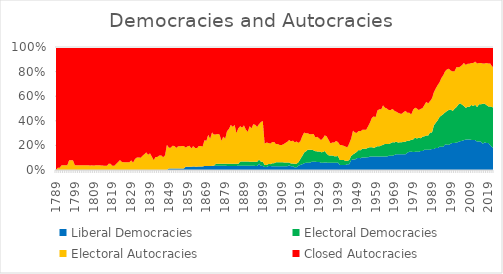
| Category | Liberal Democracies | Electoral Democracies | Electoral Autocracies | Closed Autocracies |
|---|---|---|---|---|
| 1789.0 | 0 | 0 | 0 | 50 |
| 1790.0 | 0 | 0 | 1 | 51 |
| 1791.0 | 0 | 0 | 1 | 51 |
| 1792.0 | 0 | 0 | 2 | 50 |
| 1793.0 | 0 | 0 | 2 | 50 |
| 1794.0 | 0 | 0 | 2 | 50 |
| 1795.0 | 0 | 0 | 2 | 50 |
| 1796.0 | 0 | 0 | 4 | 46 |
| 1797.0 | 0 | 0 | 4 | 46 |
| 1798.0 | 0 | 0 | 4 | 46 |
| 1799.0 | 0 | 0 | 2 | 48 |
| 1800.0 | 0 | 0 | 2 | 50 |
| 1801.0 | 0 | 0 | 2 | 49 |
| 1802.0 | 0 | 0 | 2 | 51 |
| 1803.0 | 0 | 0 | 2 | 50 |
| 1804.0 | 0 | 0 | 2 | 50 |
| 1805.0 | 0 | 0 | 2 | 50 |
| 1806.0 | 0 | 0 | 2 | 50 |
| 1807.0 | 0 | 0 | 2 | 52 |
| 1808.0 | 0 | 0 | 2 | 51 |
| 1809.0 | 0 | 0 | 2 | 52 |
| 1810.0 | 0 | 0 | 2 | 51 |
| 1811.0 | 0 | 0 | 2 | 50 |
| 1812.0 | 0 | 0 | 2 | 50 |
| 1813.0 | 0 | 0 | 2 | 52 |
| 1814.0 | 0 | 0 | 2 | 54 |
| 1815.0 | 0 | 0 | 2 | 57 |
| 1816.0 | 0 | 0 | 2 | 57 |
| 1817.0 | 0 | 0 | 3 | 57 |
| 1818.0 | 0 | 0 | 3 | 57 |
| 1819.0 | 0 | 0 | 2 | 57 |
| 1820.0 | 0 | 0 | 2 | 56 |
| 1821.0 | 0 | 0 | 3 | 57 |
| 1822.0 | 0 | 0 | 4 | 58 |
| 1823.0 | 0 | 0 | 5 | 57 |
| 1824.0 | 0 | 0 | 4 | 57 |
| 1825.0 | 0 | 0 | 4 | 59 |
| 1826.0 | 0 | 0 | 4 | 60 |
| 1827.0 | 0 | 0 | 4 | 60 |
| 1828.0 | 0 | 0 | 4 | 60 |
| 1829.0 | 0 | 0 | 5 | 59 |
| 1830.0 | 0 | 0 | 4 | 63 |
| 1831.0 | 0 | 0 | 6 | 62 |
| 1832.0 | 0 | 0 | 7 | 62 |
| 1833.0 | 0 | 0 | 7 | 62 |
| 1834.0 | 0 | 0 | 7 | 63 |
| 1835.0 | 0 | 0 | 8 | 62 |
| 1836.0 | 0 | 0 | 9 | 61 |
| 1837.0 | 0 | 0 | 10 | 60 |
| 1838.0 | 0 | 0 | 9 | 64 |
| 1839.0 | 0 | 0 | 10 | 64 |
| 1840.0 | 0 | 0 | 8 | 66 |
| 1841.0 | 0 | 0 | 6 | 69 |
| 1842.0 | 0 | 0 | 8 | 67 |
| 1843.0 | 0 | 0 | 8 | 67 |
| 1844.0 | 0 | 0 | 9 | 67 |
| 1845.0 | 0 | 0 | 9 | 67 |
| 1846.0 | 0 | 0 | 8 | 69 |
| 1847.0 | 0 | 0 | 9 | 67 |
| 1848.0 | 0 | 0 | 16 | 62 |
| 1849.0 | 1 | 0 | 13 | 63 |
| 1850.0 | 1 | 0 | 13 | 63 |
| 1851.0 | 1 | 0 | 14 | 61 |
| 1852.0 | 1 | 0 | 14 | 62 |
| 1853.0 | 1 | 0 | 13 | 64 |
| 1854.0 | 1 | 0 | 14 | 63 |
| 1855.0 | 1 | 0 | 14 | 63 |
| 1856.0 | 1 | 0 | 14 | 62 |
| 1857.0 | 1 | 0 | 14 | 62 |
| 1858.0 | 2 | 0 | 12 | 63 |
| 1859.0 | 2 | 0 | 13 | 63 |
| 1860.0 | 2 | 0 | 13 | 61 |
| 1861.0 | 2 | 0 | 11 | 61 |
| 1862.0 | 2 | 0 | 12 | 58 |
| 1863.0 | 2 | 0 | 11 | 60 |
| 1864.0 | 2 | 0 | 11 | 60 |
| 1865.0 | 2 | 0 | 12 | 58 |
| 1866.0 | 2 | 0 | 12 | 58 |
| 1867.0 | 2 | 0 | 11 | 55 |
| 1868.0 | 2 | 0 | 13 | 47 |
| 1869.0 | 2 | 0 | 13 | 48 |
| 1870.0 | 2 | 0 | 16 | 45 |
| 1871.0 | 2 | 0 | 14 | 47 |
| 1872.0 | 2 | 0 | 16 | 41 |
| 1873.0 | 2 | 0 | 15 | 42 |
| 1874.0 | 2 | 1 | 14 | 42 |
| 1875.0 | 2 | 1 | 14 | 41 |
| 1876.0 | 2 | 1 | 14 | 42 |
| 1877.0 | 2 | 1 | 11 | 45 |
| 1878.0 | 2 | 1 | 13 | 43 |
| 1879.0 | 2 | 1 | 12 | 44 |
| 1880.0 | 2 | 1 | 16 | 41 |
| 1881.0 | 2 | 1 | 17 | 40 |
| 1882.0 | 2 | 1 | 19 | 38 |
| 1883.0 | 2 | 1 | 18 | 39 |
| 1884.0 | 2 | 1 | 19 | 38 |
| 1885.0 | 2 | 1 | 15 | 42 |
| 1886.0 | 2 | 1 | 17 | 39 |
| 1887.0 | 2 | 2 | 17 | 38 |
| 1888.0 | 2 | 2 | 16 | 38 |
| 1889.0 | 2 | 2 | 17 | 37 |
| 1890.0 | 2 | 2 | 15 | 39 |
| 1891.0 | 2 | 2 | 14 | 40 |
| 1892.0 | 2 | 2 | 17 | 38 |
| 1893.0 | 2 | 2 | 16 | 39 |
| 1894.0 | 2 | 2 | 18 | 37 |
| 1895.0 | 2 | 2 | 18 | 38 |
| 1896.0 | 2 | 2 | 17 | 39 |
| 1897.0 | 3 | 2 | 17 | 37 |
| 1898.0 | 2 | 2 | 19 | 36 |
| 1899.0 | 2 | 2 | 20 | 36 |
| 1900.0 | 3 | 2 | 21 | 95 |
| 1901.0 | 3 | 2 | 22 | 94 |
| 1902.0 | 4 | 2 | 21 | 96 |
| 1903.0 | 4 | 2 | 21 | 99 |
| 1904.0 | 4 | 3 | 22 | 99 |
| 1905.0 | 4 | 3 | 22 | 98 |
| 1906.0 | 4 | 4 | 19 | 101 |
| 1907.0 | 4 | 4 | 19 | 101 |
| 1908.0 | 4 | 4 | 18 | 102 |
| 1909.0 | 4 | 4 | 18 | 102 |
| 1910.0 | 4 | 4 | 19 | 102 |
| 1911.0 | 4 | 4 | 21 | 103 |
| 1912.0 | 4 | 4 | 22 | 101 |
| 1913.0 | 5 | 3 | 24 | 99 |
| 1914.0 | 4 | 3 | 24 | 102 |
| 1915.0 | 4 | 3 | 25 | 102 |
| 1916.0 | 3 | 4 | 24 | 107 |
| 1917.0 | 3 | 4 | 25 | 106 |
| 1918.0 | 5 | 4 | 22 | 110 |
| 1919.0 | 6 | 7 | 21 | 111 |
| 1920.0 | 7 | 10 | 24 | 108 |
| 1921.0 | 8 | 13 | 24 | 103 |
| 1922.0 | 9 | 14 | 22 | 106 |
| 1923.0 | 9 | 16 | 20 | 106 |
| 1924.0 | 9 | 16 | 19 | 107 |
| 1925.0 | 10 | 15 | 19 | 107 |
| 1926.0 | 10 | 14 | 20 | 106 |
| 1927.0 | 10 | 13 | 17 | 111 |
| 1928.0 | 10 | 13 | 18 | 111 |
| 1929.0 | 10 | 13 | 16 | 113 |
| 1930.0 | 9 | 13 | 15 | 115 |
| 1931.0 | 9 | 13 | 17 | 112 |
| 1932.0 | 9 | 14 | 19 | 107 |
| 1933.0 | 9 | 11 | 21 | 109 |
| 1934.0 | 9 | 9 | 19 | 114 |
| 1935.0 | 9 | 9 | 15 | 119 |
| 1936.0 | 9 | 9 | 16 | 118 |
| 1937.0 | 9 | 8 | 17 | 118 |
| 1938.0 | 9 | 8 | 19 | 116 |
| 1939.0 | 9 | 8 | 17 | 116 |
| 1940.0 | 6 | 6 | 18 | 117 |
| 1941.0 | 6 | 6 | 18 | 118 |
| 1942.0 | 6 | 6 | 17 | 118 |
| 1943.0 | 6 | 5 | 17 | 119 |
| 1944.0 | 7 | 4 | 16 | 120 |
| 1945.0 | 7 | 5 | 20 | 116 |
| 1946.0 | 12 | 5 | 21 | 111 |
| 1947.0 | 13 | 6 | 29 | 102 |
| 1948.0 | 13 | 8 | 26 | 107 |
| 1949.0 | 15 | 8 | 24 | 109 |
| 1950.0 | 15 | 10 | 24 | 105 |
| 1951.0 | 15 | 10 | 24 | 107 |
| 1952.0 | 16 | 11 | 24 | 105 |
| 1953.0 | 16 | 11 | 24 | 105 |
| 1954.0 | 16 | 11 | 24 | 105 |
| 1955.0 | 16 | 12 | 27 | 100 |
| 1956.0 | 17 | 12 | 31 | 96 |
| 1957.0 | 17 | 12 | 37 | 90 |
| 1958.0 | 17 | 11 | 40 | 88 |
| 1959.0 | 17 | 12 | 38 | 89 |
| 1960.0 | 17 | 13 | 45 | 80 |
| 1961.0 | 17 | 13 | 47 | 79 |
| 1962.0 | 17 | 14 | 46 | 79 |
| 1963.0 | 17 | 15 | 50 | 74 |
| 1964.0 | 17 | 16 | 46 | 77 |
| 1965.0 | 17 | 16 | 45 | 78 |
| 1966.0 | 18 | 15 | 43 | 80 |
| 1967.0 | 18 | 16 | 42 | 80 |
| 1968.0 | 18 | 17 | 42 | 78 |
| 1969.0 | 19 | 16 | 40 | 81 |
| 1970.0 | 20 | 16 | 38 | 82 |
| 1971.0 | 20 | 15 | 38 | 84 |
| 1972.0 | 20 | 15 | 36 | 84 |
| 1973.0 | 20 | 15 | 36 | 84 |
| 1974.0 | 20 | 16 | 38 | 83 |
| 1975.0 | 20 | 16 | 39 | 81 |
| 1976.0 | 22 | 15 | 35 | 83 |
| 1977.0 | 23 | 14 | 35 | 83 |
| 1978.0 | 23 | 15 | 32 | 85 |
| 1979.0 | 23 | 16 | 38 | 80 |
| 1980.0 | 23 | 18 | 38 | 77 |
| 1981.0 | 23 | 17 | 38 | 78 |
| 1982.0 | 23 | 18 | 35 | 80 |
| 1983.0 | 24 | 16 | 37 | 78 |
| 1984.0 | 24 | 18 | 36 | 77 |
| 1985.0 | 26 | 17 | 40 | 74 |
| 1986.0 | 26 | 18 | 43 | 70 |
| 1987.0 | 26 | 18 | 41 | 72 |
| 1988.0 | 26 | 22 | 40 | 69 |
| 1989.0 | 27 | 21 | 44 | 66 |
| 1990.0 | 29 | 33 | 46 | 63 |
| 1991.0 | 31 | 35 | 48 | 58 |
| 1992.0 | 31 | 39 | 50 | 54 |
| 1993.0 | 33 | 42 | 49 | 50 |
| 1994.0 | 33 | 44 | 53 | 44 |
| 1995.0 | 33 | 46 | 55 | 40 |
| 1996.0 | 36 | 45 | 58 | 34 |
| 1997.0 | 36 | 48 | 59 | 32 |
| 1998.0 | 36 | 50 | 59 | 31 |
| 1999.0 | 38 | 49 | 56 | 34 |
| 2000.0 | 39 | 46 | 57 | 35 |
| 2001.0 | 39 | 49 | 54 | 35 |
| 2002.0 | 39 | 51 | 57 | 29 |
| 2003.0 | 40 | 53 | 53 | 29 |
| 2004.0 | 41 | 54 | 52 | 28 |
| 2005.0 | 42 | 52 | 57 | 26 |
| 2006.0 | 43 | 49 | 62 | 23 |
| 2007.0 | 44 | 46 | 62 | 26 |
| 2008.0 | 44 | 47 | 62 | 24 |
| 2009.0 | 44 | 47 | 62 | 24 |
| 2010.0 | 43 | 50 | 60 | 23 |
| 2011.0 | 43 | 49 | 62 | 23 |
| 2012.0 | 43 | 51 | 62 | 21 |
| 2013.0 | 41 | 50 | 63 | 24 |
| 2014.0 | 41 | 53 | 59 | 23 |
| 2015.0 | 41 | 54 | 60 | 23 |
| 2016.0 | 38 | 58 | 58 | 24 |
| 2017.0 | 40 | 56 | 58 | 24 |
| 2018.0 | 39 | 55 | 61 | 23 |
| 2019.0 | 39 | 53 | 62 | 24 |
| 2020.0 | 36 | 56 | 62 | 24 |
| 2021.0 | 33 | 58 | 59 | 28 |
| 2022.0 | 32 | 58 | 58 | 30 |